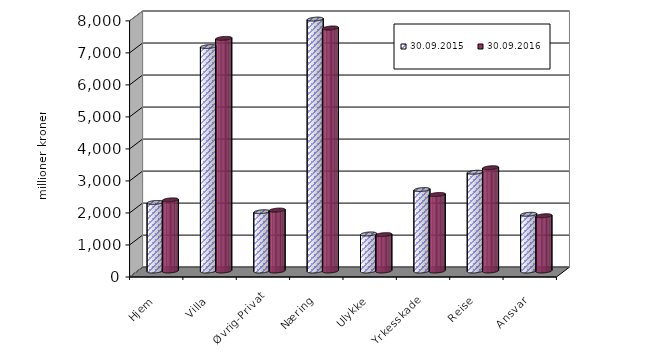
| Category | 30.09.2015 | 30.09.2016 |
|---|---|---|
| Hjem | 2140.983 | 2222.231 |
| Villa | 7010.173 | 7265.365 |
| Øvrig-Privat | 1851.5 | 1902.371 |
| Næring | 7867.255 | 7589.77 |
| Ulykke | 1157.199 | 1136.851 |
| Yrkesskade | 2543.976 | 2389.838 |
| Reise | 3085.02 | 3225.785 |
| Ansvar | 1771.493 | 1725.751 |